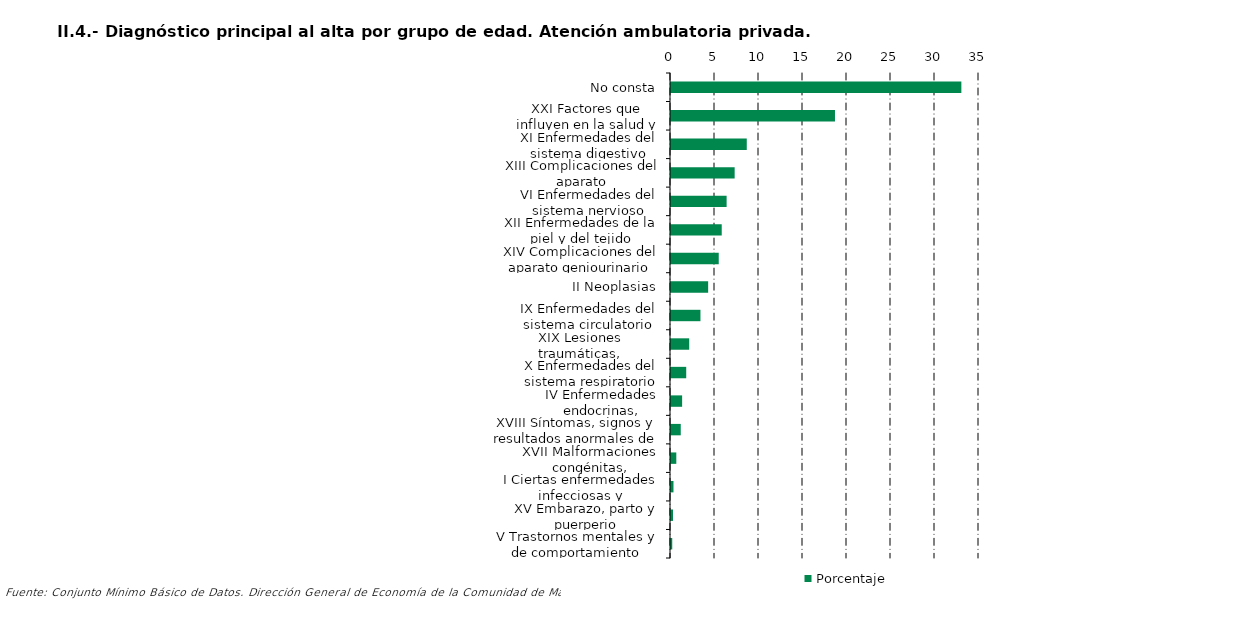
| Category | Porcentaje |
|---|---|
| No consta | 32.995 |
| XXI Factores que influyen en la salud y contacto con los servicios sanitarios | 18.633 |
| XI Enfermedades del sistema digestivo | 8.61 |
| XIII Complicaciones del aparato musculoesquelético y del tejido conectivo | 7.233 |
| VI Enfermedades del sistema nervioso | 6.32 |
| XII Enfermedades de la piel y del tejido subcutáneo | 5.764 |
| XIV Complicaciones del aparato geniourinario | 5.425 |
| II Neoplasias | 4.221 |
| IX Enfermedades del sistema circulatorio | 3.348 |
| XIX Lesiones traumáticas, envenenamientos y otras consecuencias de causas externas | 2.069 |
| X Enfermedades del sistema respiratorio | 1.73 |
| IV Enfermedades endocrinas, nutricionales y metabólicas | 1.264 |
| XVIII Síntomas, signos y resultados anormales de pruebas complementarias, no clasificados bajo otro concepto | 1.108 |
| XVII Malformaciones congénitas, deformidades y anomalías cromosómicas | 0.603 |
| I Ciertas enfermedades infecciosas y parasitarias | 0.281 |
| XV Embarazo, parto y puerperio | 0.228 |
| V Trastornos mentales y de comportamiento | 0.141 |